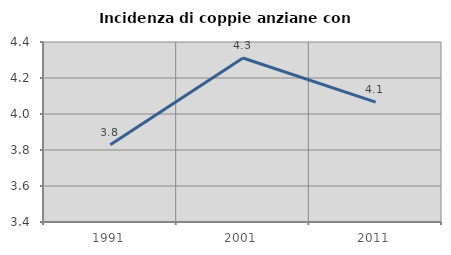
| Category | Incidenza di coppie anziane con figli |
|---|---|
| 1991.0 | 3.829 |
| 2001.0 | 4.311 |
| 2011.0 | 4.066 |